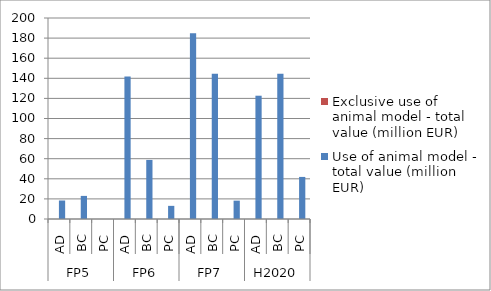
| Category | Exclusive use of animal model - total value (million EUR) | Use of animal model - total value (million EUR)   |
|---|---|---|
| 0 | 0 | 18.397 |
| 1 | 0 | 22.983 |
| 2 | 0 | 0 |
| 3 | 0 | 141.83 |
| 4 | 0 | 58.777 |
| 5 | 0 | 13.077 |
| 6 | 0 | 184.744 |
| 7 | 0 | 144.458 |
| 8 | 0 | 18.258 |
| 9 | 0 | 122.676 |
| 10 | 0 | 144.501 |
| 11 | 0 | 41.871 |